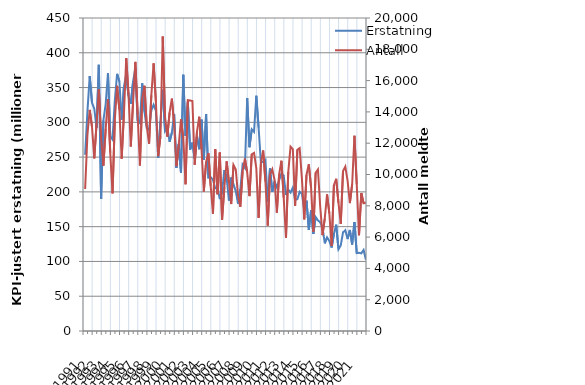
| Category | Erstatning |
|---|---|
| 1991.0 | 253.469 |
| nan | 315.36 |
| nan | 366.519 |
| nan | 328.269 |
| 1992.0 | 319.552 |
| nan | 291.981 |
| nan | 382.641 |
| nan | 189.775 |
| 1993.0 | 302.742 |
| nan | 326.193 |
| nan | 370.855 |
| nan | 280.025 |
| 1994.0 | 275.259 |
| nan | 331.438 |
| nan | 369.692 |
| nan | 358.663 |
| 1995.0 | 303.678 |
| nan | 351.299 |
| nan | 368.914 |
| nan | 337.816 |
| 1996.0 | 326.588 |
| nan | 358.519 |
| nan | 378.266 |
| nan | 302.415 |
| 1997.0 | 298.989 |
| nan | 356.113 |
| nan | 315.206 |
| nan | 291.396 |
| 1998.0 | 289.223 |
| nan | 317.273 |
| nan | 325.337 |
| nan | 316.584 |
| 1999.0 | 248.708 |
| nan | 301.782 |
| nan | 346.828 |
| nan | 287.664 |
| 2000.0 | 293.228 |
| nan | 271.936 |
| nan | 285.248 |
| nan | 311.846 |
| 2001.0 | 234.505 |
| nan | 268.968 |
| nan | 227.131 |
| nan | 368.386 |
| 2002.0 | 280.478 |
| nan | 328.826 |
| nan | 260.77 |
| nan | 270.739 |
| 2003.0 | 247.365 |
| nan | 280.296 |
| nan | 261.363 |
| nan | 303.899 |
| 2004.0 | 246.119 |
| nan | 312.001 |
| nan | 220.435 |
| nan | 221.355 |
| 2005.0 | 217.579 |
| nan | 205.064 |
| nan | 205.915 |
| nan | 189.628 |
| 2006.0 | 200.078 |
| nan | 231.376 |
| nan | 220.674 |
| nan | 187.581 |
| 2007.0 | 220.694 |
| nan | 210.821 |
| nan | 201.064 |
| nan | 183.119 |
| 2008.0 | 203.451 |
| nan | 239.218 |
| nan | 234.438 |
| nan | 334.908 |
| 2009.0 | 264.21 |
| nan | 289.974 |
| nan | 286.344 |
| nan | 338.202 |
| 2010.0 | 292.603 |
| nan | 242.276 |
| nan | 243.27 |
| nan | 246.171 |
| 2011.0 | 186.198 |
| nan | 233.898 |
| nan | 200.278 |
| nan | 214.975 |
| 2012.0 | 206.705 |
| nan | 216.668 |
| nan | 226.437 |
| nan | 223.463 |
| 2013.0 | 195.495 |
| nan | 203.199 |
| nan | 199.023 |
| nan | 206.2 |
| 2014.0 | 188.402 |
| nan | 189.607 |
| nan | 200.172 |
| nan | 197.056 |
| 2015.0 | 173.901 |
| nan | 187.368 |
| nan | 145.441 |
| nan | 173.337 |
| 2016.0 | 139.594 |
| nan | 163.833 |
| nan | 159.014 |
| nan | 156.137 |
| 2017.0 | 149.352 |
| nan | 126.055 |
| nan | 134.611 |
| nan | 129.438 |
| 2018.0 | 120.035 |
| nan | 139.312 |
| nan | 152.844 |
| nan | 117.524 |
| 2019.0 | 123.081 |
| nan | 141.817 |
| nan | 144.981 |
| nan | 132.183 |
| 2020.0 | 145.263 |
| nan | 124.327 |
| nan | 156.604 |
| nan | 111.947 |
| 2021.0 | 112.443 |
| nan | 111.632 |
| nan | 116.552 |
| nan | 102.588 |